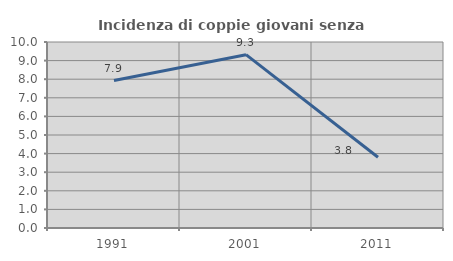
| Category | Incidenza di coppie giovani senza figli |
|---|---|
| 1991.0 | 7.93 |
| 2001.0 | 9.319 |
| 2011.0 | 3.806 |